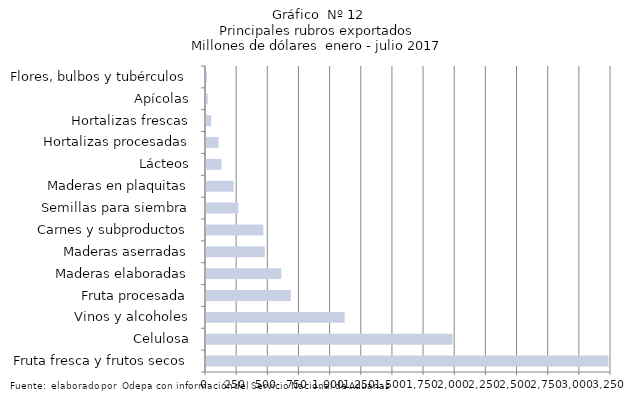
| Category | Series 7 |
|---|---|
| Fruta fresca y frutos secos | 3229232.028 |
| Celulosa | 1978864.087 |
| Vinos y alcoholes | 1112274.517 |
| Fruta procesada | 681165.321 |
| Maderas elaboradas | 603686.715 |
| Maderas aserradas | 471311.442 |
| Carnes y subproductos | 459877.602 |
| Semillas para siembra | 259811.447 |
| Maderas en plaquitas | 221509.389 |
| Lácteos | 124922.163 |
| Hortalizas procesadas | 100855.068 |
| Hortalizas frescas | 41453.501 |
| Apícolas | 13577.146 |
| Flores, bulbos y tubérculos | 7901.82 |